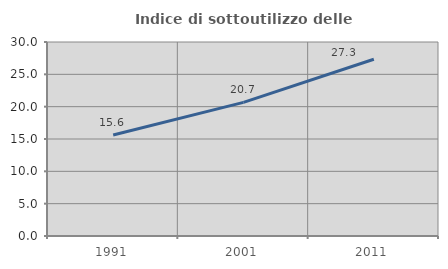
| Category | Indice di sottoutilizzo delle abitazioni  |
|---|---|
| 1991.0 | 15.625 |
| 2001.0 | 20.666 |
| 2011.0 | 27.336 |